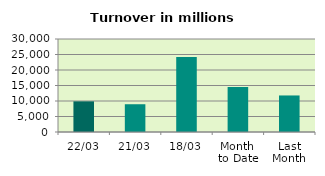
| Category | Series 0 |
|---|---|
| 22/03 | 9882.788 |
| 21/03 | 8955.631 |
| 18/03 | 24193.211 |
| Month 
to Date | 14523.322 |
| Last
Month | 11787.675 |